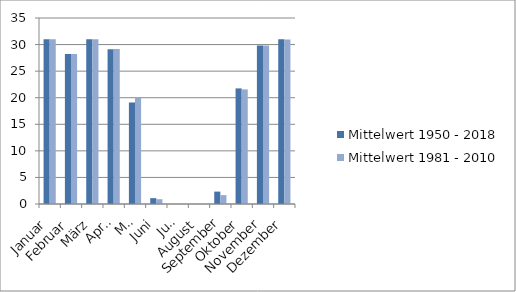
| Category | Mittelwert 1950 - 2018 | Mittelwert 1981 - 2010 |
|---|---|---|
| Januar | 31 | 31 |
| Februar | 28.246 | 28.233 |
| März | 31 | 31 |
| April | 29.13 | 29.167 |
| Mai | 19.101 | 20.1 |
| Juni | 1.101 | 0.9 |
| Juli | 0 | 0 |
| August | 0 | 0 |
| September | 2.333 | 1.667 |
| Oktober | 21.754 | 21.567 |
| November | 29.841 | 29.833 |
| Dezember | 30.986 | 30.967 |